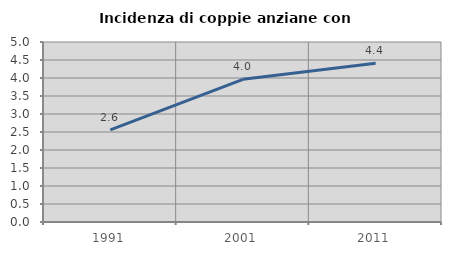
| Category | Incidenza di coppie anziane con figli |
|---|---|
| 1991.0 | 2.556 |
| 2001.0 | 3.963 |
| 2011.0 | 4.408 |